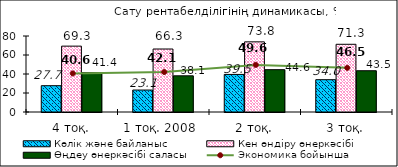
| Category | Көлік және байланыс | Кен өндіру өнеркәсібі | Өңдеу өнеркәсібі саласы |
|---|---|---|---|
| 4 тоқ. | 27.69 | 69.328 | 41.387 |
| 1 тоқ. 2008  | 23.122 | 66.305 | 38.105 |
| 2 тоқ. | 39.543 | 73.84 | 44.567 |
| 3 тоқ. | 34.002 | 71.28 | 43.454 |